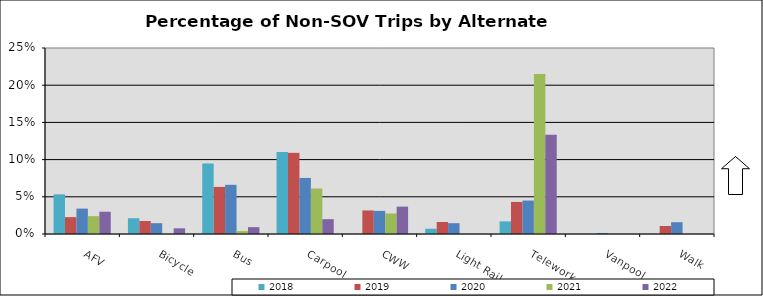
| Category | 2018 | 2019 | 2020 | 2021 | 2022 |
|---|---|---|---|---|---|
| AFV | 0.053 | 0.023 | 0.034 | 0.024 | 0.03 |
| Bicycle | 0.021 | 0.018 | 0.015 | 0 | 0.008 |
| Bus | 0.095 | 0.063 | 0.066 | 0.004 | 0.009 |
| Carpool | 0.11 | 0.109 | 0.075 | 0.061 | 0.02 |
| CWW | 0 | 0.032 | 0.031 | 0.028 | 0.037 |
| Light Rail | 0.007 | 0.016 | 0.015 | 0 | 0 |
| Telework | 0.017 | 0.043 | 0.045 | 0.215 | 0.133 |
| Vanpool | 0 | 0 | 0.001 | 0 | 0 |
| Walk | 0 | 0.011 | 0.016 | 0 | 0 |